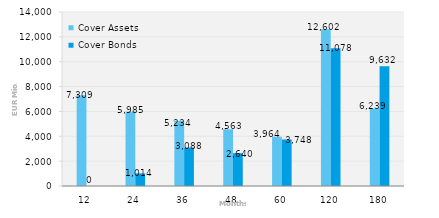
| Category | Cover Assets | Cover Bonds |
|---|---|---|
| 12.0 | 7309.318 | 0 |
| 24.0 | 5985.229 | 1014.3 |
| 36.0 | 5233.671 | 3088.049 |
| 48.0 | 4562.551 | 2640.1 |
| 60.0 | 3964.155 | 3747.622 |
| 120.0 | 12602.287 | 11077.746 |
| 180.0 | 6239.418 | 9631.869 |